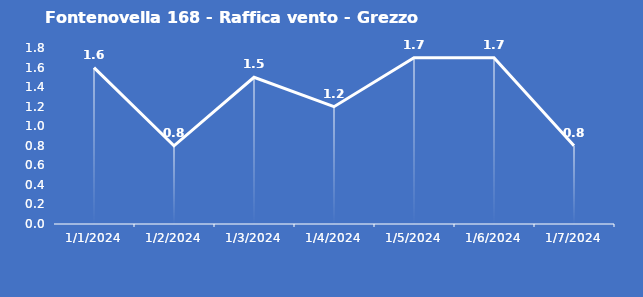
| Category | Fontenovella 168 - Raffica vento - Grezzo (m/s) |
|---|---|
| 1/1/24 | 1.6 |
| 1/2/24 | 0.8 |
| 1/3/24 | 1.5 |
| 1/4/24 | 1.2 |
| 1/5/24 | 1.7 |
| 1/6/24 | 1.7 |
| 1/7/24 | 0.8 |